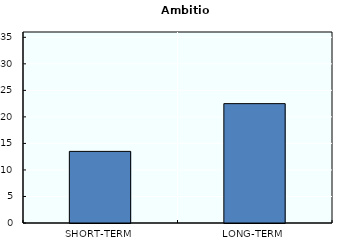
| Category | Series 0 |
|---|---|
| SHORT-TERM | 13.5 |
| LONG-TERM | 22.5 |